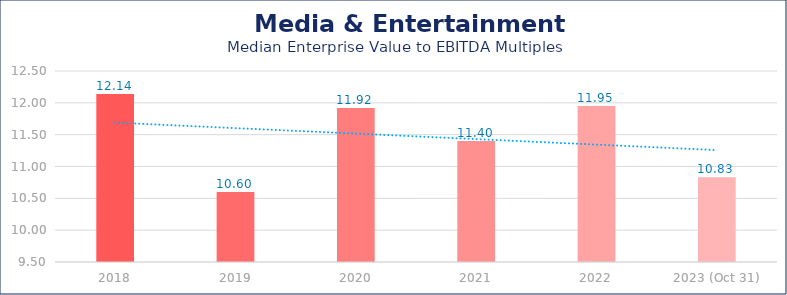
| Category | Media & Entertainment |
|---|---|
| 2018 | 12.14 |
| 2019 | 10.6 |
| 2020 | 11.92 |
| 2021 | 11.4 |
| 2022 | 11.95 |
| 2023 (Oct 31) | 10.83 |